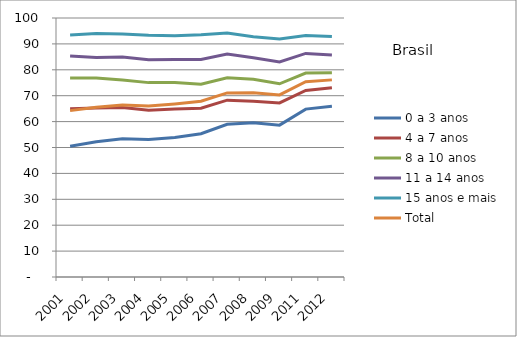
| Category | 0 a 3 anos | 4 a 7 anos | 8 a 10 anos | 11 a 14 anos | 15 anos e mais | Total |
|---|---|---|---|---|---|---|
| 2001.0 | 50.52 | 64.98 | 76.86 | 85.32 | 93.48 | 64.24 |
| 2002.0 | 52.2 | 65.24 | 76.8 | 84.78 | 93.99 | 65.5 |
| 2003.0 | 53.34 | 65.42 | 76.03 | 84.92 | 93.86 | 66.43 |
| 2004.0 | 53.1 | 64.41 | 75.05 | 83.87 | 93.36 | 66.01 |
| 2005.0 | 53.9 | 64.87 | 75.12 | 84.02 | 93.18 | 66.84 |
| 2006.0 | 55.33 | 65.16 | 74.46 | 83.96 | 93.51 | 67.87 |
| 2007.0 | 58.95 | 68.28 | 76.93 | 86.08 | 94.19 | 71.08 |
| 2008.0 | 59.58 | 67.82 | 76.38 | 84.64 | 92.73 | 71.14 |
| 2009.0 | 58.63 | 67.2 | 74.59 | 83.04 | 91.85 | 70.29 |
| 2011.0 | 64.82 | 72.02 | 78.73 | 86.32 | 93.25 | 75.38 |
| 2012.0 | 65.95 | 73.09 | 78.9 | 85.69 | 92.81 | 76.11 |